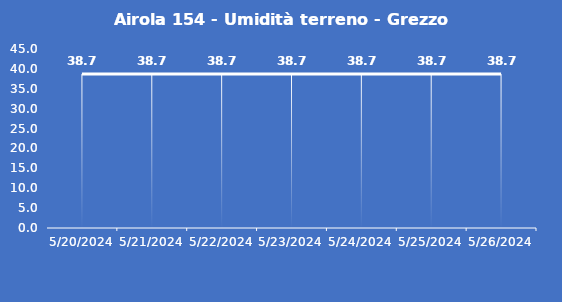
| Category | Airola 154 - Umidità terreno - Grezzo (%VWC) |
|---|---|
| 5/20/24 | 38.7 |
| 5/21/24 | 38.7 |
| 5/22/24 | 38.7 |
| 5/23/24 | 38.7 |
| 5/24/24 | 38.7 |
| 5/25/24 | 38.7 |
| 5/26/24 | 38.7 |